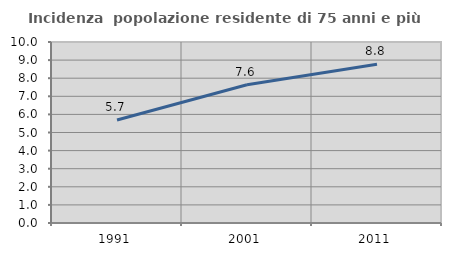
| Category | Incidenza  popolazione residente di 75 anni e più |
|---|---|
| 1991.0 | 5.689 |
| 2001.0 | 7.637 |
| 2011.0 | 8.772 |